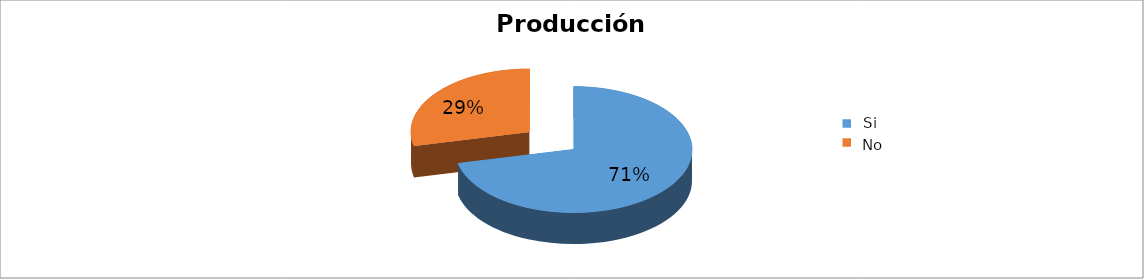
| Category | Series 0 |
|---|---|
| 0 | 0.714 |
| 1 | 0.286 |